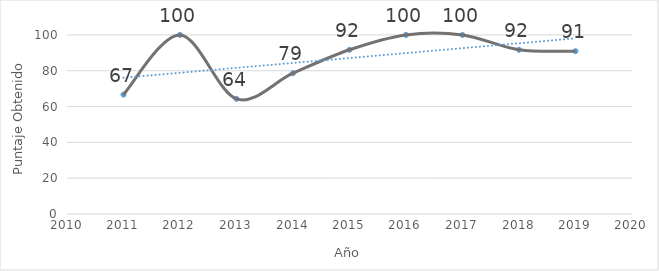
| Category | Presupuesto |
|---|---|
| 2011.0 | 66.67 |
| 2012.0 | 100 |
| 2013.0 | 64.29 |
| 2014.0 | 78.6 |
| 2015.0 | 91.7 |
| 2016.0 | 100 |
| 2017.0 | 100 |
| 2018.0 | 91.7 |
| 2019.0 | 90.91 |